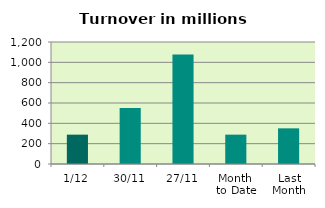
| Category | Series 0 |
|---|---|
| 1/12 | 288.602 |
| 30/11 | 550.93 |
| 27/11 | 1076.951 |
| Month 
to Date | 288.602 |
| Last
Month | 350.651 |